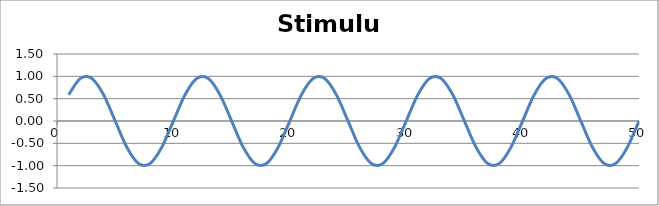
| Category | Stimulus |
|---|---|
| 1.0 | 0.588 |
| 2.0 | 0.951 |
| 3.0 | 0.951 |
| 4.0 | 0.588 |
| 5.0 | 0 |
| 6.0 | -0.588 |
| 7.0 | -0.951 |
| 8.0 | -0.951 |
| 9.0 | -0.588 |
| 10.0 | 0 |
| 11.0 | 0.588 |
| 12.0 | 0.951 |
| 13.0 | 0.951 |
| 14.0 | 0.588 |
| 15.0 | 0 |
| 16.0 | -0.588 |
| 17.0 | -0.951 |
| 18.0 | -0.951 |
| 19.0 | -0.588 |
| 20.0 | 0 |
| 21.0 | 0.588 |
| 22.0 | 0.951 |
| 23.0 | 0.951 |
| 24.0 | 0.588 |
| 25.0 | 0 |
| 26.0 | -0.588 |
| 27.0 | -0.951 |
| 28.0 | -0.951 |
| 29.0 | -0.588 |
| 30.0 | 0 |
| 31.0 | 0.588 |
| 32.0 | 0.951 |
| 33.0 | 0.951 |
| 34.0 | 0.588 |
| 35.0 | 0 |
| 36.0 | -0.588 |
| 37.0 | -0.951 |
| 38.0 | -0.951 |
| 39.0 | -0.588 |
| 40.0 | 0 |
| 41.0 | 0.588 |
| 42.0 | 0.951 |
| 43.0 | 0.951 |
| 44.0 | 0.588 |
| 45.0 | 0 |
| 46.0 | -0.588 |
| 47.0 | -0.951 |
| 48.0 | -0.951 |
| 49.0 | -0.588 |
| 50.0 | 0 |